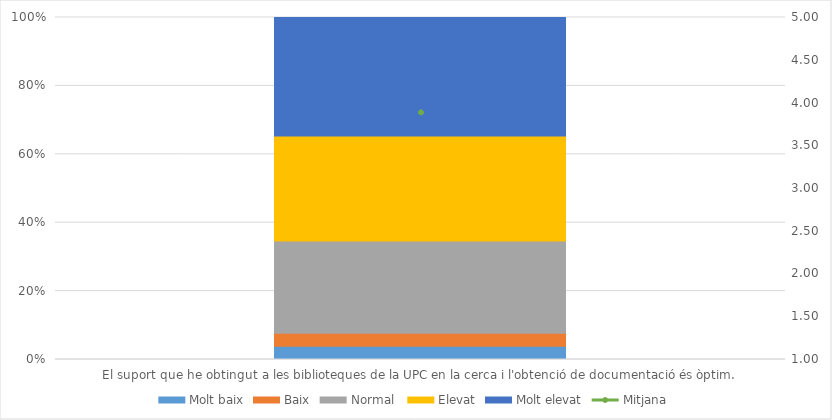
| Category | Molt baix | Baix | Normal  | Elevat | Molt elevat |
|---|---|---|---|---|---|
| El suport que he obtingut a les biblioteques de la UPC en la cerca i l'obtenció de documentació és òptim. | 1 | 1 | 7 | 8 | 9 |